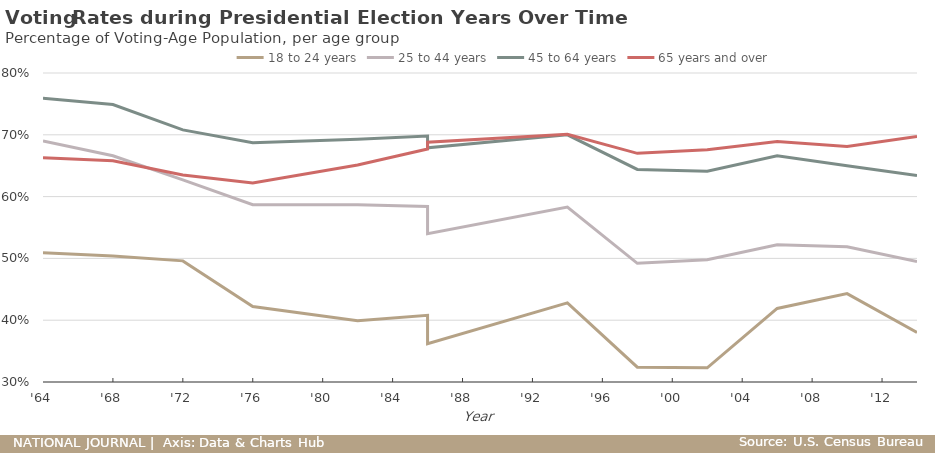
| Category | 18 to 24 years | 25 to 44 years | 45 to 64 years | 65 years and over |
|---|---|---|---|---|
| 1964-01-01 | 0.509 | 0.69 | 0.759 | 0.663 |
| 1968-01-01 | 0.504 | 0.666 | 0.749 | 0.658 |
| 1972-01-01 | 0.496 | 0.627 | 0.708 | 0.635 |
| 1976-01-01 | 0.422 | 0.587 | 0.687 | 0.622 |
| 1982-01-01 | 0.399 | 0.587 | 0.693 | 0.651 |
| 1986-01-01 | 0.408 | 0.584 | 0.698 | 0.677 |
| 1986-01-01 | 0.362 | 0.54 | 0.679 | 0.688 |
| 1994-01-01 | 0.428 | 0.583 | 0.7 | 0.701 |
| 1998-01-01 | 0.324 | 0.492 | 0.644 | 0.67 |
| 2002-01-01 | 0.323 | 0.498 | 0.641 | 0.676 |
| 2006-01-01 | 0.419 | 0.522 | 0.666 | 0.689 |
| 2010-01-01 | 0.443 | 0.519 | 0.65 | 0.681 |
| 2014-01-01 | 0.38 | 0.495 | 0.634 | 0.697 |